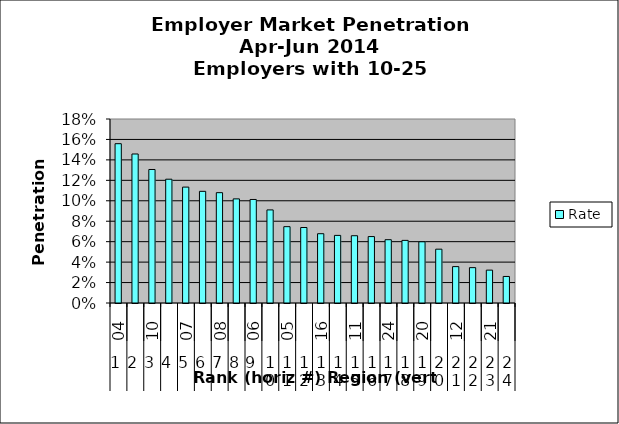
| Category | Rate |
|---|---|
| 0 | 0.156 |
| 1 | 0.146 |
| 2 | 0.131 |
| 3 | 0.121 |
| 4 | 0.113 |
| 5 | 0.109 |
| 6 | 0.108 |
| 7 | 0.102 |
| 8 | 0.101 |
| 9 | 0.091 |
| 10 | 0.075 |
| 11 | 0.074 |
| 12 | 0.068 |
| 13 | 0.066 |
| 14 | 0.066 |
| 15 | 0.065 |
| 16 | 0.062 |
| 17 | 0.061 |
| 18 | 0.06 |
| 19 | 0.053 |
| 20 | 0.036 |
| 21 | 0.035 |
| 22 | 0.032 |
| 23 | 0.026 |